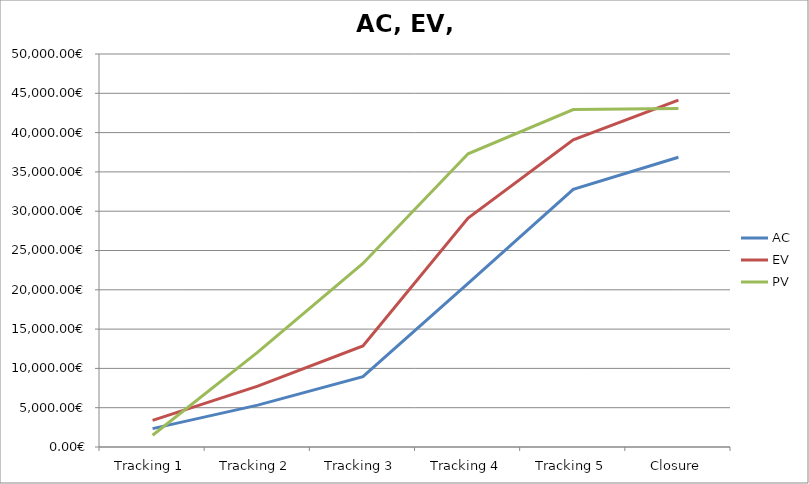
| Category | AC | EV | PV |
|---|---|---|---|
| Tracking 1 | 2340 | 3382.2 | 1500 |
| Tracking 2 | 5325 | 7746.75 | 12075 |
| Tracking 3 | 8940 | 12857.4 | 23355 |
| Tracking 4 | 20805 | 29117.1 | 37305 |
| Tracking 5 | 32790 | 39087.45 | 42930 |
| Closure | 36870 | 44130 | 43080 |